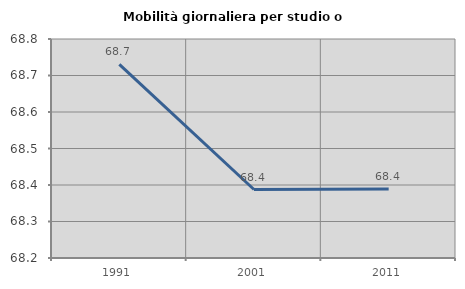
| Category | Mobilità giornaliera per studio o lavoro |
|---|---|
| 1991.0 | 68.731 |
| 2001.0 | 68.388 |
| 2011.0 | 68.389 |